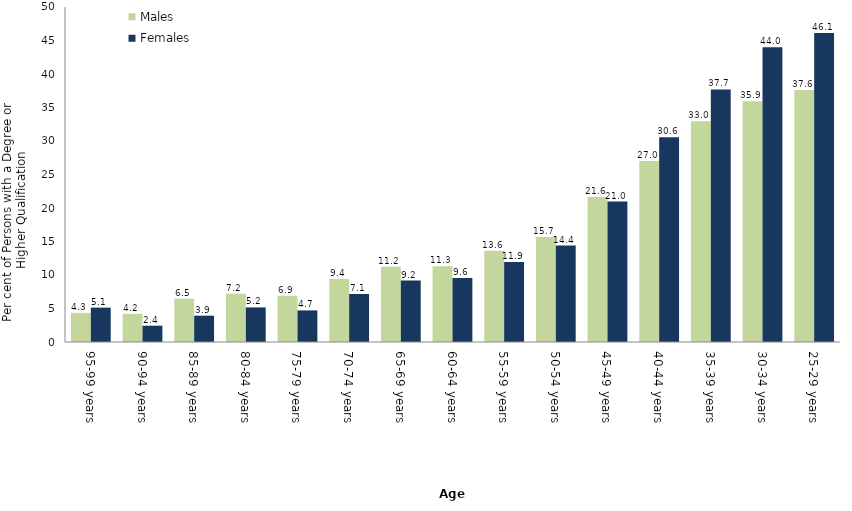
| Category | Males | Females |
|---|---|---|
| 95-99 years | 4.348 | 5.128 |
| 90-94 years | 4.207 | 2.43 |
| 85-89 years | 6.473 | 3.927 |
| 80-84 years | 7.216 | 5.16 |
| 75-79 years | 6.916 | 4.717 |
| 70-74 years | 9.413 | 7.148 |
| 65-69 years | 11.232 | 9.172 |
| 60-64 years | 11.321 | 9.554 |
| 55-59 years | 13.604 | 11.93 |
| 50-54 years | 15.664 | 14.387 |
| 45-49 years | 21.633 | 20.958 |
| 40-44 years | 27.023 | 30.554 |
| 35-39 years | 32.959 | 37.694 |
| 30-34 years | 35.948 | 43.999 |
| 25-29 years | 37.596 | 46.114 |